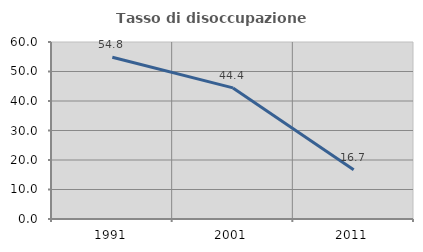
| Category | Tasso di disoccupazione giovanile  |
|---|---|
| 1991.0 | 54.839 |
| 2001.0 | 44.444 |
| 2011.0 | 16.667 |